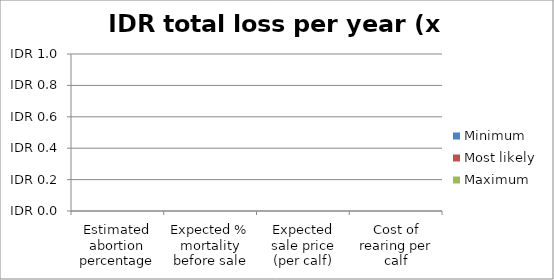
| Category | Minimum | Most likely | Maximum |
|---|---|---|---|
| Estimated abortion percentage | 0 | 0 | 0 |
| Expected % mortality before sale | 0 | 0 | 0 |
| Expected sale price (per calf) | 0 | 0 | 0 |
| Cost of rearing per calf | 0 | 0 | 0 |